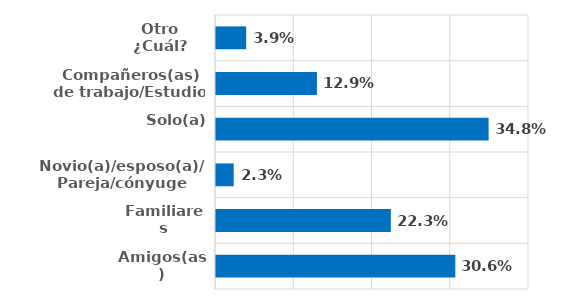
| Category | Series 0 |
|---|---|
| Amigos(as) | 0.306 |
| Familiares | 0.223 |
| Novio(a)/esposo(a)/Pareja/cónyuge | 0.023 |
| Solo(a) | 0.348 |
| Compañeros(as) de trabajo/Estudio | 0.129 |
| Otro ¿Cuál? | 0.039 |